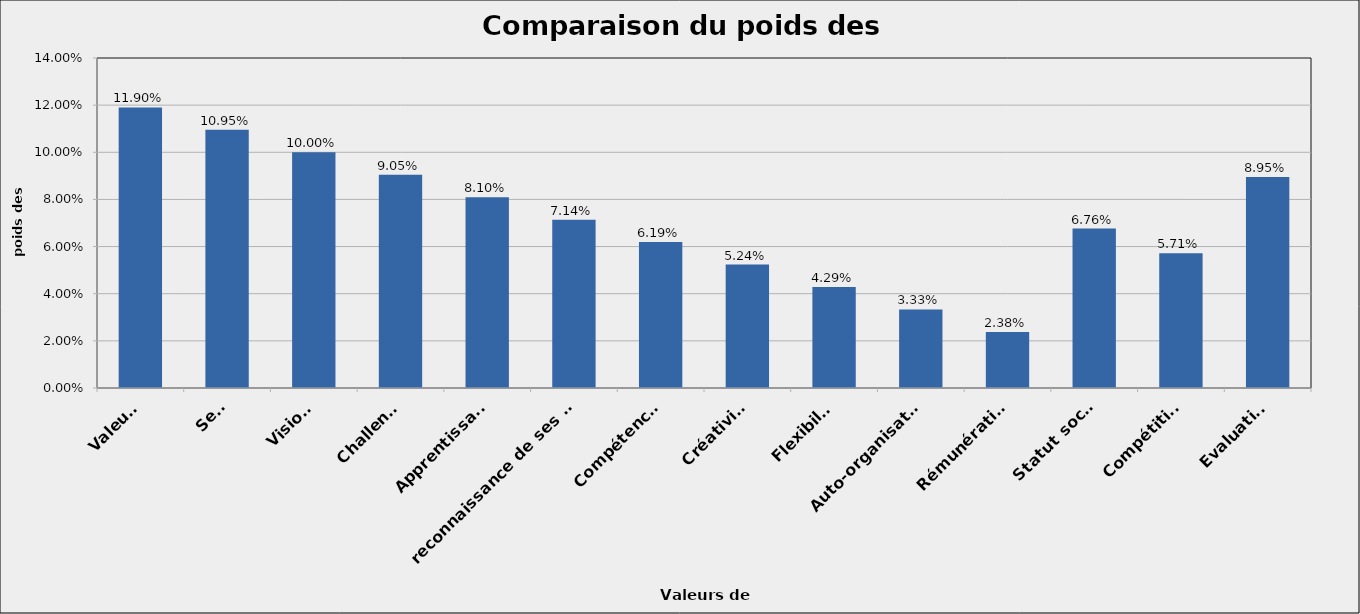
| Category | Series 0 |
|---|---|
| Valeurs | 0.119 |
| Sens | 0.11 |
| Visions | 0.1 |
| Challenge | 0.09 |
| Apprentissage | 0.081 |
| reconnaissance de ses pairs | 0.071 |
| Compétences | 0.062 |
| Créativité | 0.052 |
| Flexibilité | 0.043 |
| Auto-organisation | 0.033 |
| Rémunération | 0.024 |
| Statut social | 0.068 |
| Compétition | 0.057 |
| Evaluation | 0.09 |